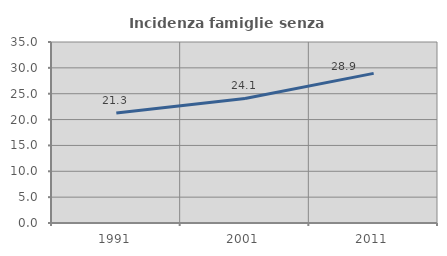
| Category | Incidenza famiglie senza nuclei |
|---|---|
| 1991.0 | 21.291 |
| 2001.0 | 24.077 |
| 2011.0 | 28.932 |